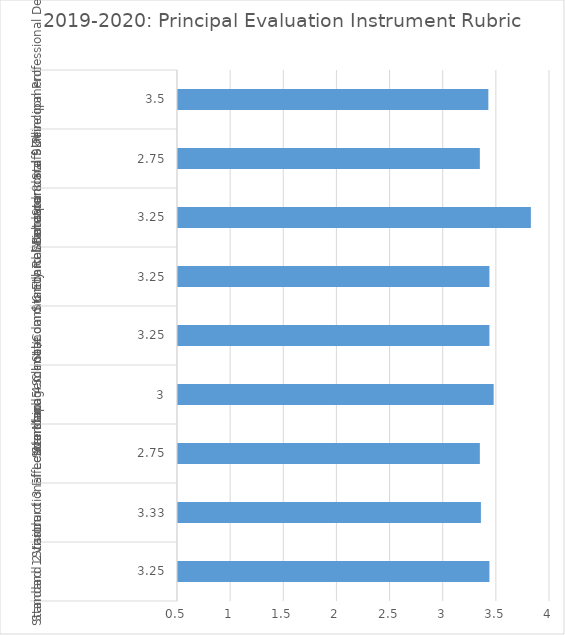
| Category | Statewide Results |
|---|---|
| 0 | 3.43 |
| 1 | 3.35 |
| 2 | 3.34 |
| 3 | 3.47 |
| 4 | 3.43 |
| 5 | 3.43 |
| 6 | 3.82 |
| 7 | 3.34 |
| 8 | 3.42 |